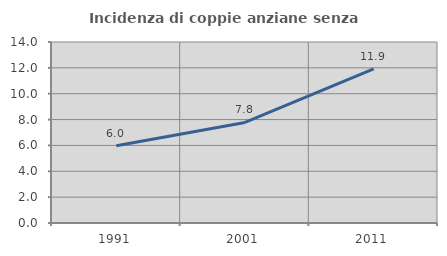
| Category | Incidenza di coppie anziane senza figli  |
|---|---|
| 1991.0 | 5.979 |
| 2001.0 | 7.78 |
| 2011.0 | 11.927 |